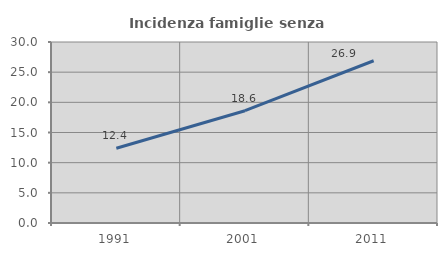
| Category | Incidenza famiglie senza nuclei |
|---|---|
| 1991.0 | 12.396 |
| 2001.0 | 18.612 |
| 2011.0 | 26.896 |